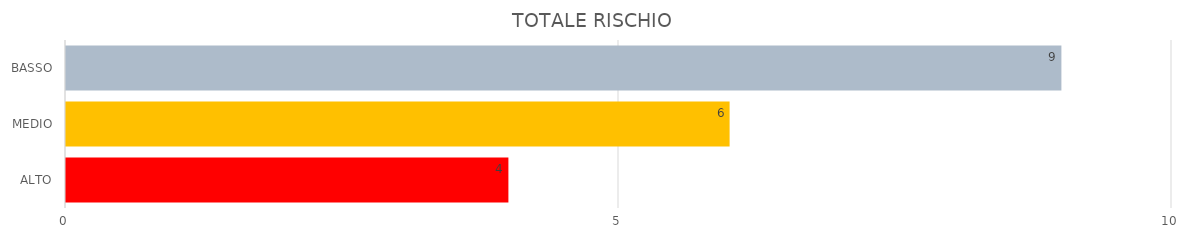
| Category | Series 1 | Series 0 |
|---|---|---|
| ALTO | 4 | 4 |
| MEDIO | 6 | 6 |
| BASSO | 9 | 9 |